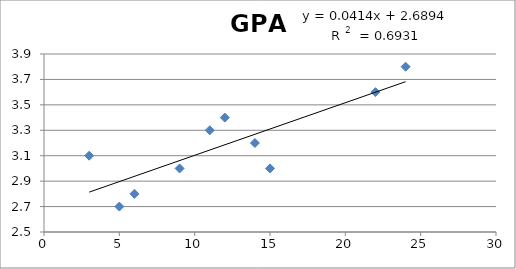
| Category | GPA |
|---|---|
| 6.0 | 2.8 |
| 14.0 | 3.2 |
| 3.0 | 3.1 |
| 22.0 | 3.6 |
| 9.0 | 3 |
| 11.0 | 3.3 |
| 12.0 | 3.4 |
| 5.0 | 2.7 |
| 24.0 | 3.8 |
| 15.0 | 3 |